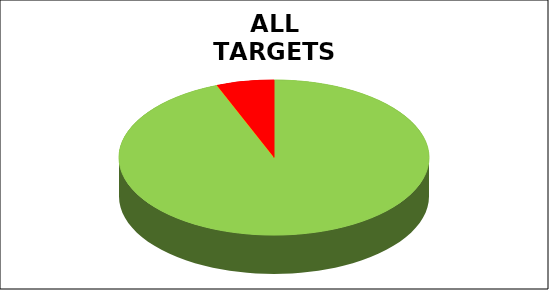
| Category | Series 0 |
|---|---|
| Green | 0.94 |
| Amber | 0 |
| Red | 0.06 |